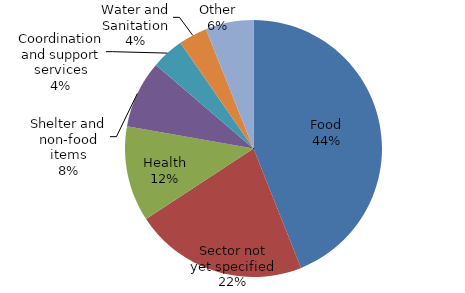
| Category | Series 0 |
|---|---|
| Food | 102.386 |
| Sector not yet specified | 50.73 |
| Health | 27.997 |
| Shelter and non-food items | 19.775 |
| Coordination and support services | 9.522 |
| Water and Sanitation | 8.387 |
| Other | 14.069 |